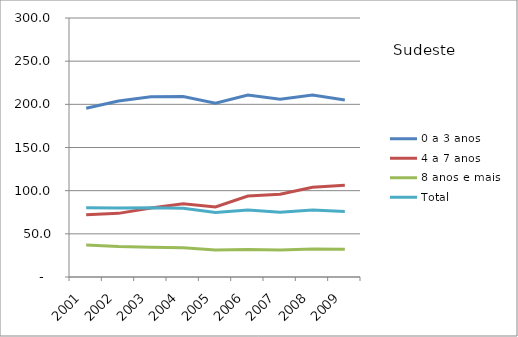
| Category | 0 a 3 anos | 4 a 7 anos | 8 anos e mais | Total |
|---|---|---|---|---|
| 2001.0 | 195.4 | 72 | 37 | 80.1 |
| 2002.0 | 203.9 | 73.7 | 35.3 | 80 |
| 2003.0 | 208.9 | 79.9 | 34.6 | 80.3 |
| 2004.0 | 209.1 | 84.7 | 33.9 | 79.5 |
| 2005.0 | 201.4 | 81.1 | 31.4 | 74.6 |
| 2006.0 | 210.9 | 93.8 | 31.9 | 77.7 |
| 2007.0 | 205.8 | 95.9 | 31.3 | 75.1 |
| 2008.0 | 210.8 | 104 | 32.3 | 77.5 |
| 2009.0 | 205.1 | 106.4 | 32.1 | 75.9 |